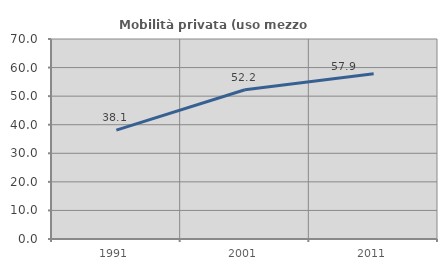
| Category | Mobilità privata (uso mezzo privato) |
|---|---|
| 1991.0 | 38.12 |
| 2001.0 | 52.234 |
| 2011.0 | 57.872 |